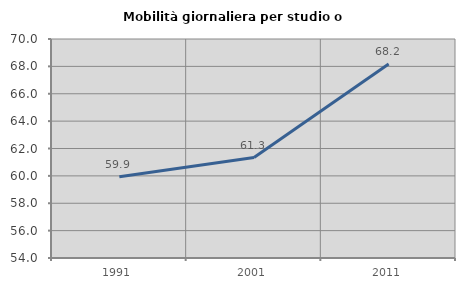
| Category | Mobilità giornaliera per studio o lavoro |
|---|---|
| 1991.0 | 59.943 |
| 2001.0 | 61.34 |
| 2011.0 | 68.168 |